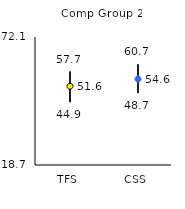
| Category | 25th | 75th | Mean |
|---|---|---|---|
| TFS | 44.9 | 57.7 | 51.56 |
| CSS | 48.7 | 60.7 | 54.56 |